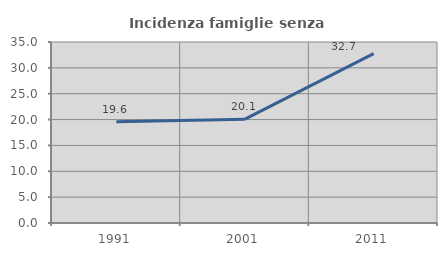
| Category | Incidenza famiglie senza nuclei |
|---|---|
| 1991.0 | 19.573 |
| 2001.0 | 20.072 |
| 2011.0 | 32.735 |